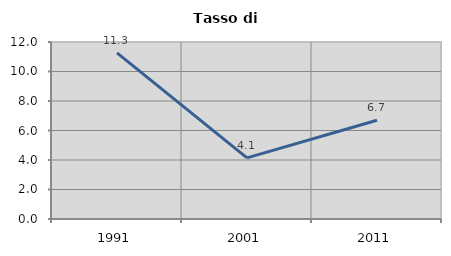
| Category | Tasso di disoccupazione   |
|---|---|
| 1991.0 | 11.263 |
| 2001.0 | 4.142 |
| 2011.0 | 6.696 |